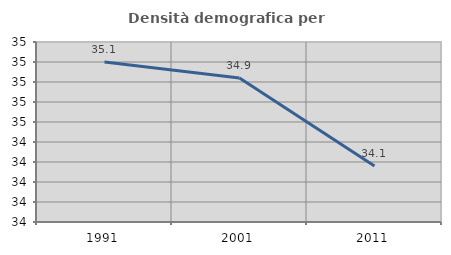
| Category | Densità demografica |
|---|---|
| 1991.0 | 35.1 |
| 2001.0 | 34.94 |
| 2011.0 | 34.06 |